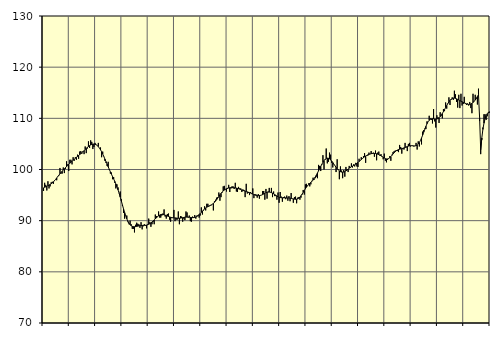
| Category | Samtliga fast anställda (inkl. fast anställda utomlands) | Series 1 |
|---|---|---|
| nan | 95.8 | 96.42 |
| 87.0 | 97.4 | 96.53 |
| 87.0 | 97 | 96.62 |
| 87.0 | 95.9 | 96.73 |
| 87.0 | 97.7 | 96.84 |
| 87.0 | 96.3 | 96.95 |
| 87.0 | 96.7 | 97.07 |
| 87.0 | 97.5 | 97.21 |
| 87.0 | 97.6 | 97.38 |
| 87.0 | 97.2 | 97.58 |
| 87.0 | 97.9 | 97.82 |
| 87.0 | 98.1 | 98.07 |
| nan | 97.9 | 98.35 |
| 88.0 | 98.7 | 98.63 |
| 88.0 | 98.8 | 98.9 |
| 88.0 | 100.3 | 99.16 |
| 88.0 | 99.2 | 99.42 |
| 88.0 | 99.2 | 99.66 |
| 88.0 | 100.4 | 99.9 |
| 88.0 | 99.3 | 100.13 |
| 88.0 | 100.1 | 100.36 |
| 88.0 | 101.6 | 100.58 |
| 88.0 | 101 | 100.8 |
| 88.0 | 99.7 | 101.01 |
| nan | 101.9 | 101.22 |
| 89.0 | 101.9 | 101.43 |
| 89.0 | 101 | 101.62 |
| 89.0 | 102.4 | 101.81 |
| 89.0 | 101.7 | 102 |
| 89.0 | 102.4 | 102.19 |
| 89.0 | 101.9 | 102.38 |
| 89.0 | 102.9 | 102.56 |
| 89.0 | 102.1 | 102.74 |
| 89.0 | 103.5 | 102.92 |
| 89.0 | 103.6 | 103.09 |
| 89.0 | 103.1 | 103.29 |
| nan | 103.6 | 103.49 |
| 90.0 | 103 | 103.71 |
| 90.0 | 104.5 | 103.92 |
| 90.0 | 103.2 | 104.13 |
| 90.0 | 104.1 | 104.32 |
| 90.0 | 105.5 | 104.5 |
| 90.0 | 104.2 | 104.66 |
| 90.0 | 105.7 | 104.8 |
| 90.0 | 105.4 | 104.9 |
| 90.0 | 104 | 104.96 |
| 90.0 | 104.4 | 104.98 |
| 90.0 | 105.2 | 104.94 |
| nan | 104.8 | 104.84 |
| 91.0 | 104.7 | 104.68 |
| 91.0 | 105.2 | 104.47 |
| 91.0 | 104.2 | 104.19 |
| 91.0 | 104.3 | 103.85 |
| 91.0 | 102.4 | 103.46 |
| 91.0 | 103.5 | 103.02 |
| 91.0 | 102.6 | 102.55 |
| 91.0 | 101.7 | 102.05 |
| 91.0 | 101.3 | 101.54 |
| 91.0 | 100.7 | 101.04 |
| 91.0 | 101.5 | 100.54 |
| nan | 99.9 | 100.03 |
| 92.0 | 99.2 | 99.54 |
| 92.0 | 99.4 | 99.07 |
| 92.0 | 98.1 | 98.6 |
| 92.0 | 98.5 | 98.15 |
| 92.0 | 97.4 | 97.68 |
| 92.0 | 96.3 | 97.18 |
| 92.0 | 97.1 | 96.62 |
| 92.0 | 96.5 | 96.01 |
| 92.0 | 95.4 | 95.34 |
| 92.0 | 95.7 | 94.61 |
| 92.0 | 94.2 | 93.85 |
| nan | 92.9 | 93.07 |
| 93.0 | 91.5 | 92.32 |
| 93.0 | 90.4 | 91.6 |
| 93.0 | 91 | 90.94 |
| 93.0 | 91 | 90.36 |
| 93.0 | 89.7 | 89.87 |
| 93.0 | 89.3 | 89.48 |
| 93.0 | 90 | 89.2 |
| 93.0 | 89.3 | 89.01 |
| 93.0 | 88.4 | 88.89 |
| 93.0 | 88.4 | 88.83 |
| 93.0 | 87.7 | 88.82 |
| nan | 89.2 | 88.84 |
| 94.0 | 89.6 | 88.88 |
| 94.0 | 89.4 | 88.93 |
| 94.0 | 89.3 | 88.98 |
| 94.0 | 88.6 | 89.02 |
| 94.0 | 89.7 | 89.05 |
| 94.0 | 88.3 | 89.07 |
| 94.0 | 88.9 | 89.08 |
| 94.0 | 89.3 | 89.08 |
| 94.0 | 89 | 89.1 |
| 94.0 | 88.5 | 89.13 |
| 94.0 | 89.3 | 89.19 |
| nan | 90.4 | 89.29 |
| 95.0 | 89.7 | 89.41 |
| 95.0 | 88.8 | 89.57 |
| 95.0 | 89.3 | 89.74 |
| 95.0 | 89.8 | 89.93 |
| 95.0 | 89.3 | 90.14 |
| 95.0 | 91.2 | 90.35 |
| 95.0 | 90.9 | 90.57 |
| 95.0 | 90.7 | 90.77 |
| 95.0 | 91.8 | 90.94 |
| 95.0 | 90.6 | 91.09 |
| 95.0 | 90.6 | 91.19 |
| nan | 91 | 91.23 |
| 96.0 | 91.4 | 91.21 |
| 96.0 | 92.2 | 91.15 |
| 96.0 | 90.8 | 91.08 |
| 96.0 | 90.4 | 90.99 |
| 96.0 | 91.3 | 90.9 |
| 96.0 | 91.4 | 90.82 |
| 96.0 | 90.2 | 90.73 |
| 96.0 | 89.8 | 90.66 |
| 96.0 | 90.5 | 90.61 |
| 96.0 | 90.6 | 90.57 |
| 96.0 | 92.1 | 90.55 |
| nan | 89.9 | 90.54 |
| 97.0 | 90.2 | 90.52 |
| 97.0 | 90.2 | 90.49 |
| 97.0 | 91.8 | 90.47 |
| 97.0 | 89.3 | 90.48 |
| 97.0 | 90.9 | 90.5 |
| 97.0 | 90.8 | 90.54 |
| 97.0 | 89.8 | 90.58 |
| 97.0 | 90.4 | 90.63 |
| 97.0 | 90.1 | 90.68 |
| 97.0 | 91.8 | 90.7 |
| 97.0 | 91.6 | 90.71 |
| nan | 90.6 | 90.7 |
| 98.0 | 91 | 90.67 |
| 98.0 | 89.9 | 90.64 |
| 98.0 | 89.8 | 90.61 |
| 98.0 | 90.8 | 90.59 |
| 98.0 | 90.7 | 90.6 |
| 98.0 | 91.1 | 90.64 |
| 98.0 | 90.4 | 90.72 |
| 98.0 | 91 | 90.84 |
| 98.0 | 91.1 | 91 |
| 98.0 | 90.6 | 91.19 |
| 98.0 | 91 | 91.39 |
| nan | 92.6 | 91.62 |
| 99.0 | 91.2 | 91.85 |
| 99.0 | 92 | 92.09 |
| 99.0 | 92.8 | 92.31 |
| 99.0 | 92 | 92.49 |
| 99.0 | 93.3 | 92.64 |
| 99.0 | 93.3 | 92.75 |
| 99.0 | 92.8 | 92.86 |
| 99.0 | 92.9 | 92.96 |
| 99.0 | 93 | 93.08 |
| 99.0 | 93.2 | 93.21 |
| 99.0 | 92 | 93.37 |
| nan | 93.8 | 93.58 |
| 0.0 | 94.1 | 93.82 |
| 0.0 | 94.5 | 94.11 |
| 0.0 | 94.6 | 94.42 |
| 0.0 | 95.5 | 94.74 |
| 0.0 | 93.9 | 95.06 |
| 0.0 | 94.6 | 95.34 |
| 0.0 | 95.5 | 95.6 |
| 0.0 | 96.7 | 95.81 |
| 0.0 | 96.8 | 95.98 |
| 0.0 | 96.2 | 96.12 |
| 0.0 | 95.7 | 96.24 |
| nan | 96.2 | 96.34 |
| 1.0 | 97 | 96.4 |
| 1.0 | 95.6 | 96.43 |
| 1.0 | 96.3 | 96.45 |
| 1.0 | 96.7 | 96.45 |
| 1.0 | 96.7 | 96.44 |
| 1.0 | 96.2 | 96.44 |
| 1.0 | 97.4 | 96.41 |
| 1.0 | 95.7 | 96.37 |
| 1.0 | 95.6 | 96.31 |
| 1.0 | 96.6 | 96.24 |
| 1.0 | 96.3 | 96.16 |
| nan | 96.3 | 96.08 |
| 2.0 | 95.6 | 96 |
| 2.0 | 96.1 | 95.91 |
| 2.0 | 96 | 95.84 |
| 2.0 | 94.6 | 95.77 |
| 2.0 | 97.2 | 95.7 |
| 2.0 | 95.3 | 95.63 |
| 2.0 | 95.4 | 95.55 |
| 2.0 | 95 | 95.47 |
| 2.0 | 95.6 | 95.39 |
| 2.0 | 95.2 | 95.29 |
| 2.0 | 96.3 | 95.19 |
| nan | 94.4 | 95.09 |
| 3.0 | 95.2 | 95.01 |
| 3.0 | 95.1 | 94.95 |
| 3.0 | 94.5 | 94.91 |
| 3.0 | 95.2 | 94.9 |
| 3.0 | 94.3 | 94.91 |
| 3.0 | 94.9 | 94.94 |
| 3.0 | 95 | 95.01 |
| 3.0 | 95.8 | 95.1 |
| 3.0 | 95.8 | 95.22 |
| 3.0 | 94.1 | 95.34 |
| 3.0 | 96.2 | 95.45 |
| nan | 94.3 | 95.53 |
| 4.0 | 95.7 | 95.58 |
| 4.0 | 96.4 | 95.59 |
| 4.0 | 95.6 | 95.56 |
| 4.0 | 96.4 | 95.48 |
| 4.0 | 94.6 | 95.38 |
| 4.0 | 95.7 | 95.25 |
| 4.0 | 94.8 | 95.1 |
| 4.0 | 94.8 | 94.95 |
| 4.0 | 94.1 | 94.8 |
| 4.0 | 95.5 | 94.67 |
| 4.0 | 93.5 | 94.58 |
| nan | 95.6 | 94.52 |
| 5.0 | 94.7 | 94.49 |
| 5.0 | 93.7 | 94.47 |
| 5.0 | 94.6 | 94.46 |
| 5.0 | 94.7 | 94.46 |
| 5.0 | 94.2 | 94.46 |
| 5.0 | 94.9 | 94.45 |
| 5.0 | 93.9 | 94.44 |
| 5.0 | 94.8 | 94.43 |
| 5.0 | 93.8 | 94.4 |
| 5.0 | 95.4 | 94.36 |
| 5.0 | 94.3 | 94.31 |
| nan | 93.5 | 94.26 |
| 6.0 | 94.6 | 94.21 |
| 6.0 | 94.7 | 94.18 |
| 6.0 | 93.4 | 94.19 |
| 6.0 | 94.5 | 94.26 |
| 6.0 | 94.6 | 94.4 |
| 6.0 | 94.1 | 94.61 |
| 6.0 | 94.5 | 94.88 |
| 6.0 | 95.1 | 95.2 |
| 6.0 | 96 | 95.54 |
| 6.0 | 95.1 | 95.89 |
| 6.0 | 97.1 | 96.24 |
| nan | 97.2 | 96.55 |
| 7.0 | 96.9 | 96.83 |
| 7.0 | 97.3 | 97.07 |
| 7.0 | 96.7 | 97.28 |
| 7.0 | 97.1 | 97.48 |
| 7.0 | 97.8 | 97.69 |
| 7.0 | 98.4 | 97.93 |
| 7.0 | 98 | 98.2 |
| 7.0 | 98.3 | 98.53 |
| 7.0 | 98.6 | 98.9 |
| 7.0 | 98.3 | 99.31 |
| 7.0 | 100.9 | 99.74 |
| nan | 100.7 | 100.17 |
| 8.0 | 99.7 | 100.6 |
| 8.0 | 100.9 | 101.02 |
| 8.0 | 102.8 | 101.41 |
| 8.0 | 100 | 101.74 |
| 8.0 | 101.9 | 102 |
| 8.0 | 104.1 | 102.16 |
| 8.0 | 101.2 | 102.22 |
| 8.0 | 101.5 | 102.19 |
| 8.0 | 103.3 | 102.08 |
| 8.0 | 102.9 | 101.89 |
| 8.0 | 101.3 | 101.65 |
| nan | 100.4 | 101.36 |
| 9.0 | 101 | 101.05 |
| 9.0 | 100.7 | 100.73 |
| 9.0 | 99.5 | 100.43 |
| 9.0 | 102 | 100.15 |
| 9.0 | 100 | 99.92 |
| 9.0 | 98.1 | 99.73 |
| 9.0 | 100.6 | 99.58 |
| 9.0 | 99.8 | 99.5 |
| 9.0 | 98.3 | 99.47 |
| 9.0 | 99.9 | 99.5 |
| 9.0 | 98.6 | 99.58 |
| nan | 100.5 | 99.71 |
| 10.0 | 100.1 | 99.89 |
| 10.0 | 99.5 | 100.08 |
| 10.0 | 100.7 | 100.26 |
| 10.0 | 100.3 | 100.41 |
| 10.0 | 101.2 | 100.55 |
| 10.0 | 100.4 | 100.66 |
| 10.0 | 101 | 100.78 |
| 10.0 | 100.6 | 100.9 |
| 10.0 | 101.3 | 101.04 |
| 10.0 | 100.6 | 101.2 |
| 10.0 | 100.5 | 101.38 |
| nan | 102.1 | 101.55 |
| 11.0 | 101.7 | 101.75 |
| 11.0 | 102.4 | 101.94 |
| 11.0 | 102.1 | 102.13 |
| 11.0 | 102.6 | 102.31 |
| 11.0 | 103.2 | 102.48 |
| 11.0 | 101.3 | 102.63 |
| 11.0 | 102.7 | 102.76 |
| 11.0 | 102.7 | 102.87 |
| 11.0 | 103.3 | 102.96 |
| 11.0 | 103 | 103.03 |
| 11.0 | 103.6 | 103.09 |
| nan | 103.2 | 103.13 |
| 12.0 | 103.3 | 103.14 |
| 12.0 | 102.5 | 103.14 |
| 12.0 | 103.7 | 103.12 |
| 12.0 | 101.8 | 103.07 |
| 12.0 | 103.3 | 103 |
| 12.0 | 103.5 | 102.91 |
| 12.0 | 102.7 | 102.81 |
| 12.0 | 103 | 102.68 |
| 12.0 | 102.6 | 102.54 |
| 12.0 | 102 | 102.38 |
| 12.0 | 103.1 | 102.24 |
| nan | 101.7 | 102.12 |
| 13.0 | 101.4 | 102.07 |
| 13.0 | 101.9 | 102.07 |
| 13.0 | 102.2 | 102.15 |
| 13.0 | 102.6 | 102.31 |
| 13.0 | 101.7 | 102.52 |
| 13.0 | 102.9 | 102.77 |
| 13.0 | 103.4 | 103.03 |
| 13.0 | 103.6 | 103.28 |
| 13.0 | 103.7 | 103.49 |
| 13.0 | 103.8 | 103.67 |
| 13.0 | 103.6 | 103.8 |
| nan | 103.4 | 103.9 |
| 14.0 | 104.8 | 103.96 |
| 14.0 | 104.4 | 104.02 |
| 14.0 | 103.1 | 104.08 |
| 14.0 | 104 | 104.15 |
| 14.0 | 103.9 | 104.22 |
| 14.0 | 105.2 | 104.32 |
| 14.0 | 104.3 | 104.41 |
| 14.0 | 103.6 | 104.49 |
| 14.0 | 105 | 104.57 |
| 14.0 | 105.2 | 104.62 |
| 14.0 | 104.5 | 104.65 |
| nan | 104.7 | 104.66 |
| 15.0 | 104.7 | 104.63 |
| 15.0 | 104.5 | 104.61 |
| 15.0 | 104.6 | 104.61 |
| 15.0 | 105.2 | 104.66 |
| 15.0 | 103.9 | 104.77 |
| 15.0 | 105.5 | 104.97 |
| 15.0 | 104.5 | 105.26 |
| 15.0 | 105.7 | 105.67 |
| 15.0 | 104.9 | 106.15 |
| 15.0 | 107.4 | 106.7 |
| 15.0 | 107.7 | 107.29 |
| nan | 108 | 107.88 |
| 16.0 | 107.9 | 108.44 |
| 16.0 | 109.4 | 108.94 |
| 16.0 | 109.3 | 109.34 |
| 16.0 | 110.5 | 109.62 |
| 16.0 | 110 | 109.81 |
| 16.0 | 109.7 | 109.9 |
| 16.0 | 109 | 109.92 |
| 16.0 | 111.8 | 109.9 |
| 16.0 | 109.4 | 109.87 |
| 16.0 | 108.2 | 109.85 |
| 16.0 | 110.6 | 109.87 |
| nan | 110.2 | 109.94 |
| 17.0 | 109.1 | 110.1 |
| 17.0 | 111.2 | 110.32 |
| 17.0 | 110.5 | 110.62 |
| 17.0 | 110 | 110.95 |
| 17.0 | 111.8 | 111.32 |
| 17.0 | 111.4 | 111.7 |
| 17.0 | 113.1 | 112.1 |
| 17.0 | 111.9 | 112.5 |
| 17.0 | 112.8 | 112.88 |
| 17.0 | 114.1 | 113.23 |
| 17.0 | 112.6 | 113.52 |
| nan | 113.6 | 113.74 |
| 18.0 | 114.1 | 113.88 |
| 18.0 | 113.6 | 113.95 |
| 18.0 | 115.4 | 113.95 |
| 18.0 | 114.7 | 113.9 |
| 18.0 | 113.2 | 113.81 |
| 18.0 | 112.1 | 113.7 |
| 18.0 | 114.6 | 113.58 |
| 18.0 | 112 | 113.46 |
| 18.0 | 114.8 | 113.35 |
| 18.0 | 112.5 | 113.24 |
| 18.0 | 112.8 | 113.13 |
| nan | 114.2 | 113.02 |
| 19.0 | 113 | 112.92 |
| 19.0 | 112.6 | 112.83 |
| 19.0 | 112.9 | 112.76 |
| 19.0 | 112.5 | 112.72 |
| 19.0 | 113.2 | 112.74 |
| 19.0 | 112 | 112.81 |
| 19.0 | 111 | 112.93 |
| 19.0 | 114.8 | 113.1 |
| 19.0 | 113.4 | 113.31 |
| 19.0 | 114.6 | 113.58 |
| 19.0 | 113.8 | 113.9 |
| nan | 112.7 | 114.26 |
| 20.0 | 115.8 | 114.63 |
| 20.0 | 109.5 | 110.15 |
| 20.0 | 103 | 103.81 |
| 20.0 | 105.8 | 106.14 |
| 20.0 | 108.2 | 107.83 |
| 20.0 | 110.8 | 109.05 |
| 20.0 | 110.8 | 109.91 |
| 20.0 | 109.7 | 110.51 |
| 20.0 | 110.4 | 110.9 |
| 20.0 | 111 | 111.15 |
| 20.0 | 111.1 | 111.32 |